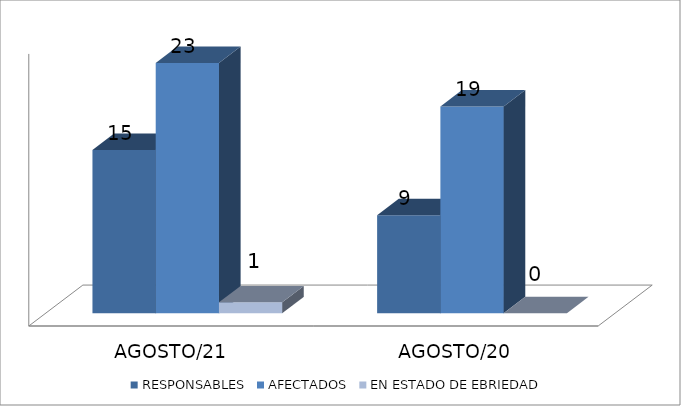
| Category | RESPONSABLES | AFECTADOS | EN ESTADO DE EBRIEDAD |
|---|---|---|---|
| AGOSTO/21 | 15 | 23 | 1 |
| AGOSTO/20 | 9 | 19 | 0 |